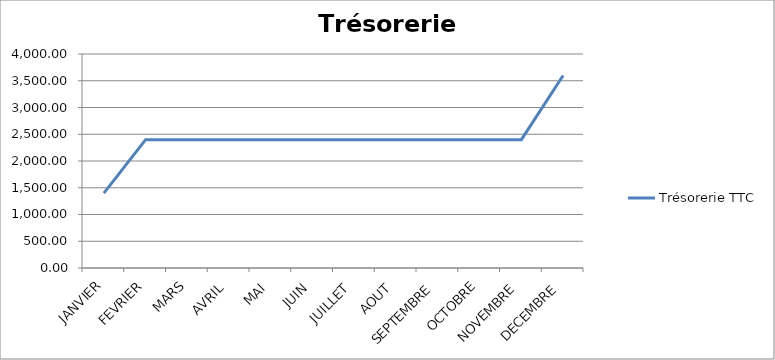
| Category | Trésorerie TTC |
|---|---|
| JANVIER | 1398.8 |
| FEVRIER | 2398.8 |
| MARS | 2398.8 |
| AVRIL | 2398.8 |
| MAI | 2398.8 |
| JUIN | 2398.8 |
| JUILLET | 2398.8 |
| AOUT | 2398.8 |
| SEPTEMBRE | 2398.8 |
| OCTOBRE | 2398.8 |
| NOVEMBRE | 2398.8 |
| DECEMBRE | 3598.8 |